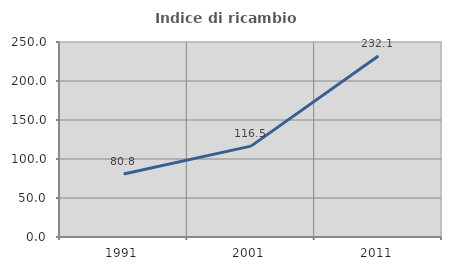
| Category | Indice di ricambio occupazionale  |
|---|---|
| 1991.0 | 80.846 |
| 2001.0 | 116.533 |
| 2011.0 | 232.069 |